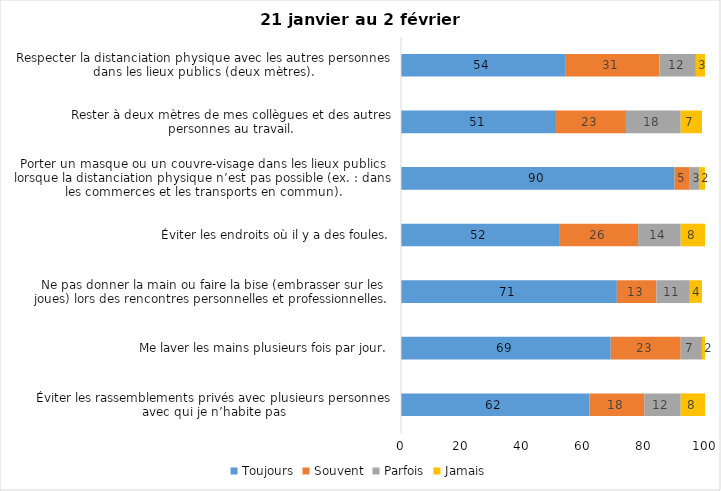
| Category | Toujours | Souvent | Parfois | Jamais |
|---|---|---|---|---|
| Éviter les rassemblements privés avec plusieurs personnes avec qui je n’habite pas | 62 | 18 | 12 | 8 |
| Me laver les mains plusieurs fois par jour. | 69 | 23 | 7 | 2 |
| Ne pas donner la main ou faire la bise (embrasser sur les joues) lors des rencontres personnelles et professionnelles. | 71 | 13 | 11 | 4 |
| Éviter les endroits où il y a des foules. | 52 | 26 | 14 | 8 |
| Porter un masque ou un couvre-visage dans les lieux publics lorsque la distanciation physique n’est pas possible (ex. : dans les commerces et les transports en commun). | 90 | 5 | 3 | 2 |
| Rester à deux mètres de mes collègues et des autres personnes au travail. | 51 | 23 | 18 | 7 |
| Respecter la distanciation physique avec les autres personnes dans les lieux publics (deux mètres). | 54 | 31 | 12 | 3 |